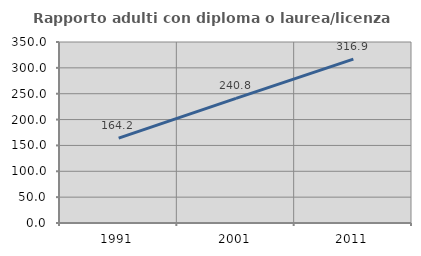
| Category | Rapporto adulti con diploma o laurea/licenza media  |
|---|---|
| 1991.0 | 164.179 |
| 2001.0 | 240.845 |
| 2011.0 | 316.867 |